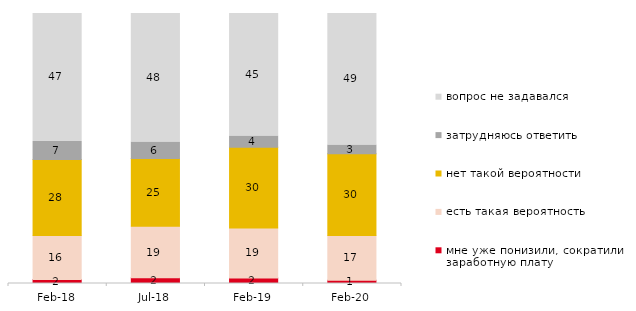
| Category | мне уже понизили, сократили заработную плату | есть такая вероятность | нет такой вероятности | затрудняюсь ответить | вопрос не задавался |
|---|---|---|---|---|---|
| 2018-02-01 | 1.5 | 16.25 | 28.15 | 6.7 | 47.4 |
| 2018-07-01 | 2.1 | 19.1 | 25.1 | 6.15 | 47.55 |
| 2019-02-01 | 2.05 | 18.55 | 29.85 | 4.2 | 45.35 |
| 2020-02-01 | 1.188 | 16.584 | 30.297 | 3.267 | 48.663 |